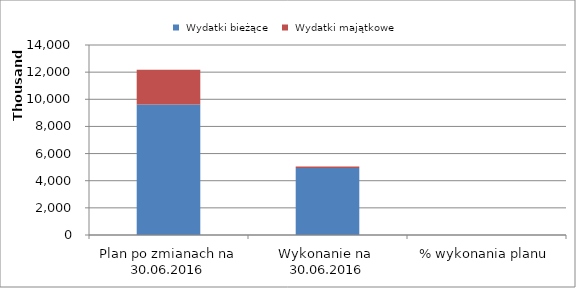
| Category |  Wydatki bieżące |  Wydatki majątkowe |
|---|---|---|
| Plan po zmianach na 30.06.2016 | 9610814.96 | 2556763 |
| Wykonanie na  30.06.2016 | 4936581.8 | 104021.88 |
| % wykonania planu | 0.514 | 0.041 |